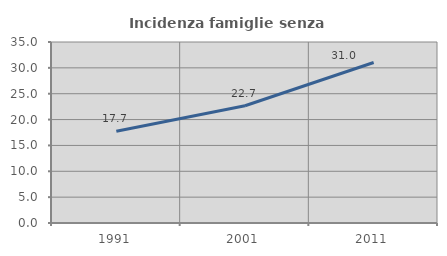
| Category | Incidenza famiglie senza nuclei |
|---|---|
| 1991.0 | 17.737 |
| 2001.0 | 22.677 |
| 2011.0 | 31.038 |